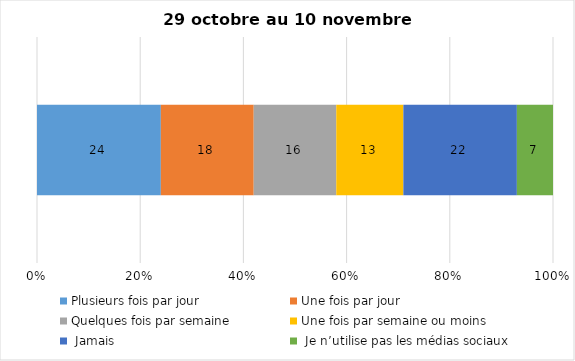
| Category | Plusieurs fois par jour | Une fois par jour | Quelques fois par semaine   | Une fois par semaine ou moins   |  Jamais   |  Je n’utilise pas les médias sociaux |
|---|---|---|---|---|---|---|
| 0 | 24 | 18 | 16 | 13 | 22 | 7 |